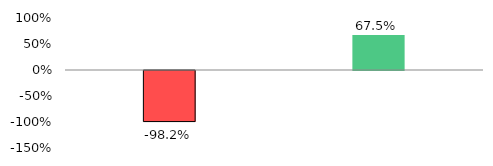
| Category | Series 1 |
|---|---|
| No of Current A/Cs Opened during Month | -0.982 |
| No of Current A/cs Opened Progressive | 0.675 |